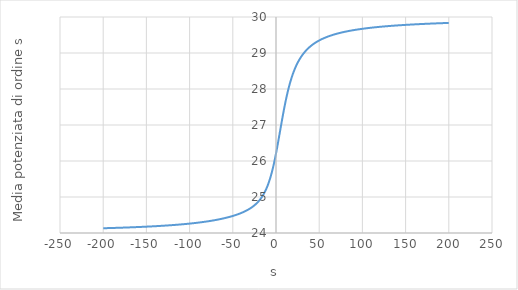
| Category | Series 0 |
|---|---|
| -200.0 | 24.132 |
| -199.0 | 24.133 |
| -198.0 | 24.133 |
| -197.0 | 24.134 |
| -196.0 | 24.135 |
| -195.0 | 24.136 |
| -194.0 | 24.136 |
| -193.0 | 24.137 |
| -192.0 | 24.138 |
| -191.0 | 24.138 |
| -190.0 | 24.139 |
| -189.0 | 24.14 |
| -188.0 | 24.141 |
| -187.0 | 24.141 |
| -186.0 | 24.142 |
| -185.0 | 24.143 |
| -184.0 | 24.144 |
| -183.0 | 24.144 |
| -182.0 | 24.145 |
| -181.0 | 24.146 |
| -180.0 | 24.147 |
| -179.0 | 24.148 |
| -178.0 | 24.148 |
| -177.0 | 24.149 |
| -176.0 | 24.15 |
| -175.0 | 24.151 |
| -174.0 | 24.152 |
| -173.0 | 24.153 |
| -172.0 | 24.154 |
| -171.0 | 24.155 |
| -170.0 | 24.155 |
| -169.0 | 24.156 |
| -168.0 | 24.157 |
| -167.0 | 24.158 |
| -166.0 | 24.159 |
| -165.0 | 24.16 |
| -164.0 | 24.161 |
| -163.0 | 24.162 |
| -162.0 | 24.163 |
| -161.0 | 24.164 |
| -160.0 | 24.165 |
| -159.0 | 24.166 |
| -158.0 | 24.167 |
| -157.0 | 24.168 |
| -156.0 | 24.169 |
| -155.0 | 24.17 |
| -154.0 | 24.172 |
| -153.0 | 24.173 |
| -152.0 | 24.174 |
| -151.0 | 24.175 |
| -150.0 | 24.176 |
| -149.0 | 24.177 |
| -148.0 | 24.178 |
| -147.0 | 24.18 |
| -146.0 | 24.181 |
| -145.0 | 24.182 |
| -144.0 | 24.183 |
| -143.0 | 24.185 |
| -142.0 | 24.186 |
| -141.0 | 24.187 |
| -140.0 | 24.189 |
| -139.0 | 24.19 |
| -138.0 | 24.191 |
| -137.0 | 24.193 |
| -136.0 | 24.194 |
| -135.0 | 24.195 |
| -134.0 | 24.197 |
| -133.0 | 24.198 |
| -132.0 | 24.2 |
| -131.0 | 24.201 |
| -130.0 | 24.203 |
| -129.0 | 24.204 |
| -128.0 | 24.206 |
| -127.0 | 24.207 |
| -126.0 | 24.209 |
| -125.0 | 24.211 |
| -124.0 | 24.212 |
| -123.0 | 24.214 |
| -122.0 | 24.216 |
| -121.0 | 24.217 |
| -120.0 | 24.219 |
| -119.0 | 24.221 |
| -118.0 | 24.223 |
| -117.0 | 24.225 |
| -116.0 | 24.227 |
| -115.0 | 24.228 |
| -114.0 | 24.23 |
| -113.0 | 24.232 |
| -112.0 | 24.234 |
| -111.0 | 24.236 |
| -110.0 | 24.238 |
| -109.0 | 24.241 |
| -108.0 | 24.243 |
| -107.0 | 24.245 |
| -106.0 | 24.247 |
| -105.0 | 24.249 |
| -104.0 | 24.252 |
| -103.0 | 24.254 |
| -102.0 | 24.256 |
| -101.0 | 24.259 |
| -100.0 | 24.261 |
| -99.0 | 24.264 |
| -98.0 | 24.266 |
| -97.0 | 24.269 |
| -96.0 | 24.271 |
| -95.0 | 24.274 |
| -94.0 | 24.277 |
| -93.0 | 24.279 |
| -92.0 | 24.282 |
| -91.0 | 24.285 |
| -90.0 | 24.288 |
| -89.0 | 24.291 |
| -88.0 | 24.294 |
| -87.0 | 24.297 |
| -86.0 | 24.3 |
| -85.0 | 24.303 |
| -84.0 | 24.307 |
| -83.0 | 24.31 |
| -82.0 | 24.313 |
| -81.0 | 24.317 |
| -80.0 | 24.32 |
| -79.0 | 24.324 |
| -78.0 | 24.328 |
| -77.0 | 24.332 |
| -76.0 | 24.335 |
| -75.0 | 24.339 |
| -74.0 | 24.343 |
| -73.0 | 24.347 |
| -72.0 | 24.352 |
| -71.0 | 24.356 |
| -70.0 | 24.36 |
| -69.0 | 24.365 |
| -68.0 | 24.369 |
| -67.0 | 24.374 |
| -66.0 | 24.379 |
| -65.0 | 24.384 |
| -64.0 | 24.389 |
| -63.0 | 24.394 |
| -62.0 | 24.399 |
| -61.0 | 24.404 |
| -60.0 | 24.41 |
| -59.0 | 24.415 |
| -58.0 | 24.421 |
| -57.0 | 24.427 |
| -56.0 | 24.433 |
| -55.0 | 24.439 |
| -54.0 | 24.446 |
| -53.0 | 24.452 |
| -52.0 | 24.459 |
| -51.0 | 24.466 |
| -50.0 | 24.473 |
| -49.0 | 24.481 |
| -48.0 | 24.488 |
| -47.0 | 24.496 |
| -46.0 | 24.504 |
| -45.0 | 24.512 |
| -44.0 | 24.521 |
| -43.0 | 24.53 |
| -42.0 | 24.539 |
| -41.0 | 24.549 |
| -40.0 | 24.558 |
| -39.0 | 24.569 |
| -38.0 | 24.579 |
| -37.0 | 24.59 |
| -36.0 | 24.602 |
| -35.0 | 24.614 |
| -34.0 | 24.626 |
| -33.0 | 24.639 |
| -32.0 | 24.652 |
| -31.0 | 24.667 |
| -30.0 | 24.682 |
| -29.0 | 24.697 |
| -28.0 | 24.714 |
| -27.0 | 24.731 |
| -26.0 | 24.749 |
| -25.0 | 24.769 |
| -24.0 | 24.789 |
| -23.0 | 24.811 |
| -22.0 | 24.834 |
| -21.0 | 24.859 |
| -20.0 | 24.885 |
| -19.0 | 24.914 |
| -18.0 | 24.944 |
| -17.0 | 24.977 |
| -16.0 | 25.013 |
| -15.0 | 25.051 |
| -14.0 | 25.093 |
| -13.0 | 25.137 |
| -12.0 | 25.186 |
| -11.0 | 25.239 |
| -10.0 | 25.297 |
| -9.0 | 25.36 |
| -8.0 | 25.428 |
| -7.0 | 25.503 |
| -6.0 | 25.583 |
| -5.0 | 25.67 |
| -4.0 | 25.764 |
| -3.0 | 25.865 |
| -2.0 | 25.973 |
| -1.0 | 26.087 |
| 1e-05 | 26.207 |
| 1.0 | 26.333 |
| 2.0 | 26.464 |
| 3.0 | 26.598 |
| 4.0 | 26.734 |
| 5.0 | 26.871 |
| 6.0 | 27.008 |
| 7.0 | 27.143 |
| 8.0 | 27.275 |
| 9.0 | 27.403 |
| 10.0 | 27.527 |
| 11.0 | 27.645 |
| 12.0 | 27.757 |
| 13.0 | 27.864 |
| 14.0 | 27.965 |
| 15.0 | 28.059 |
| 16.0 | 28.148 |
| 17.0 | 28.231 |
| 18.0 | 28.309 |
| 19.0 | 28.381 |
| 20.0 | 28.449 |
| 21.0 | 28.512 |
| 22.0 | 28.571 |
| 23.0 | 28.627 |
| 24.0 | 28.678 |
| 25.0 | 28.726 |
| 26.0 | 28.772 |
| 27.0 | 28.814 |
| 28.0 | 28.854 |
| 29.0 | 28.891 |
| 30.0 | 28.927 |
| 31.0 | 28.96 |
| 32.0 | 28.991 |
| 33.0 | 29.02 |
| 34.0 | 29.048 |
| 35.0 | 29.075 |
| 36.0 | 29.1 |
| 37.0 | 29.123 |
| 38.0 | 29.146 |
| 39.0 | 29.167 |
| 40.0 | 29.188 |
| 41.0 | 29.207 |
| 42.0 | 29.226 |
| 43.0 | 29.244 |
| 44.0 | 29.26 |
| 45.0 | 29.277 |
| 46.0 | 29.292 |
| 47.0 | 29.307 |
| 48.0 | 29.321 |
| 49.0 | 29.335 |
| 50.0 | 29.348 |
| 51.0 | 29.361 |
| 52.0 | 29.373 |
| 53.0 | 29.385 |
| 54.0 | 29.396 |
| 55.0 | 29.407 |
| 56.0 | 29.417 |
| 57.0 | 29.427 |
| 58.0 | 29.437 |
| 59.0 | 29.447 |
| 60.0 | 29.456 |
| 61.0 | 29.465 |
| 62.0 | 29.473 |
| 63.0 | 29.481 |
| 64.0 | 29.489 |
| 65.0 | 29.497 |
| 66.0 | 29.505 |
| 67.0 | 29.512 |
| 68.0 | 29.519 |
| 69.0 | 29.526 |
| 70.0 | 29.533 |
| 71.0 | 29.539 |
| 72.0 | 29.546 |
| 73.0 | 29.552 |
| 74.0 | 29.558 |
| 75.0 | 29.564 |
| 76.0 | 29.569 |
| 77.0 | 29.575 |
| 78.0 | 29.58 |
| 79.0 | 29.586 |
| 80.0 | 29.591 |
| 81.0 | 29.596 |
| 82.0 | 29.601 |
| 83.0 | 29.606 |
| 84.0 | 29.61 |
| 85.0 | 29.615 |
| 86.0 | 29.619 |
| 87.0 | 29.624 |
| 88.0 | 29.628 |
| 89.0 | 29.632 |
| 90.0 | 29.636 |
| 91.0 | 29.64 |
| 92.0 | 29.644 |
| 93.0 | 29.648 |
| 94.0 | 29.651 |
| 95.0 | 29.655 |
| 96.0 | 29.659 |
| 97.0 | 29.662 |
| 98.0 | 29.666 |
| 99.0 | 29.669 |
| 100.0 | 29.672 |
| 101.0 | 29.675 |
| 102.0 | 29.679 |
| 103.0 | 29.682 |
| 104.0 | 29.685 |
| 105.0 | 29.688 |
| 106.0 | 29.691 |
| 107.0 | 29.694 |
| 108.0 | 29.696 |
| 109.0 | 29.699 |
| 110.0 | 29.702 |
| 111.0 | 29.705 |
| 112.0 | 29.707 |
| 113.0 | 29.71 |
| 114.0 | 29.712 |
| 115.0 | 29.715 |
| 116.0 | 29.717 |
| 117.0 | 29.72 |
| 118.0 | 29.722 |
| 119.0 | 29.724 |
| 120.0 | 29.727 |
| 121.0 | 29.729 |
| 122.0 | 29.731 |
| 123.0 | 29.733 |
| 124.0 | 29.735 |
| 125.0 | 29.737 |
| 126.0 | 29.74 |
| 127.0 | 29.742 |
| 128.0 | 29.744 |
| 129.0 | 29.746 |
| 130.0 | 29.748 |
| 131.0 | 29.749 |
| 132.0 | 29.751 |
| 133.0 | 29.753 |
| 134.0 | 29.755 |
| 135.0 | 29.757 |
| 136.0 | 29.759 |
| 137.0 | 29.76 |
| 138.0 | 29.762 |
| 139.0 | 29.764 |
| 140.0 | 29.766 |
| 141.0 | 29.767 |
| 142.0 | 29.769 |
| 143.0 | 29.77 |
| 144.0 | 29.772 |
| 145.0 | 29.774 |
| 146.0 | 29.775 |
| 147.0 | 29.777 |
| 148.0 | 29.778 |
| 149.0 | 29.78 |
| 150.0 | 29.781 |
| 151.0 | 29.783 |
| 152.0 | 29.784 |
| 153.0 | 29.785 |
| 154.0 | 29.787 |
| 155.0 | 29.788 |
| 156.0 | 29.789 |
| 157.0 | 29.791 |
| 158.0 | 29.792 |
| 159.0 | 29.793 |
| 160.0 | 29.795 |
| 161.0 | 29.796 |
| 162.0 | 29.797 |
| 163.0 | 29.798 |
| 164.0 | 29.8 |
| 165.0 | 29.801 |
| 166.0 | 29.802 |
| 167.0 | 29.803 |
| 168.0 | 29.804 |
| 169.0 | 29.806 |
| 170.0 | 29.807 |
| 171.0 | 29.808 |
| 172.0 | 29.809 |
| 173.0 | 29.81 |
| 174.0 | 29.811 |
| 175.0 | 29.812 |
| 176.0 | 29.813 |
| 177.0 | 29.814 |
| 178.0 | 29.815 |
| 179.0 | 29.816 |
| 180.0 | 29.817 |
| 181.0 | 29.818 |
| 182.0 | 29.819 |
| 183.0 | 29.82 |
| 184.0 | 29.821 |
| 185.0 | 29.822 |
| 186.0 | 29.823 |
| 187.0 | 29.824 |
| 188.0 | 29.825 |
| 189.0 | 29.826 |
| 190.0 | 29.827 |
| 191.0 | 29.828 |
| 192.0 | 29.829 |
| 193.0 | 29.83 |
| 194.0 | 29.831 |
| 195.0 | 29.831 |
| 196.0 | 29.832 |
| 197.0 | 29.833 |
| 198.0 | 29.834 |
| 199.0 | 29.835 |
| 200.0 | 29.836 |